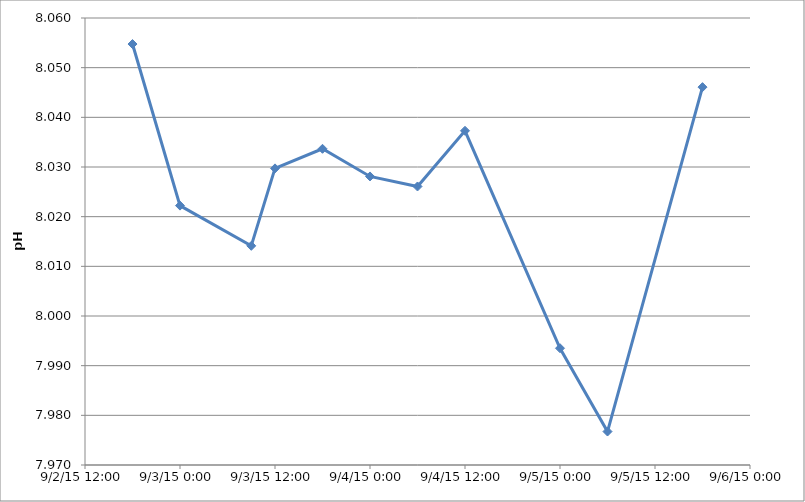
| Category | Series 0 |
|---|---|
| 42249.75 | 8.055 |
| 42250.0 | 8.022 |
| 42250.375 | 8.014 |
| 42250.5 | 8.03 |
| 42250.75 | 8.034 |
| 42251.0 | 8.028 |
| 42251.25 | 8.026 |
| 42251.5 | 8.037 |
| 42252.0 | 7.994 |
| 42252.25 | 7.977 |
| 42252.75 | 8.046 |